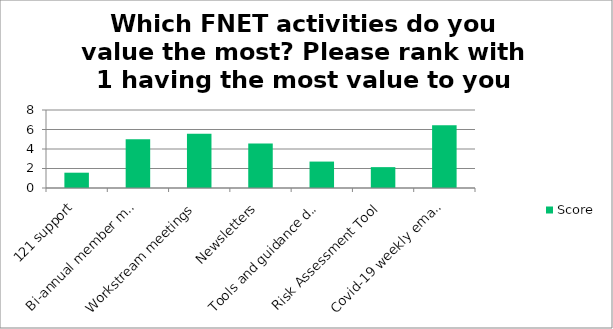
| Category | Score |
|---|---|
| 121 support | 1.57 |
| Bi-annual member meetings | 5 |
| Workstream meetings | 5.57 |
| Newsletters | 4.57 |
| Tools and guidance developed by workstreams e.g. buyer training/ director training | 2.71 |
| Risk Assessment Tool | 2.14 |
| Covid-19 weekly emails and bi-weekly calls | 6.43 |